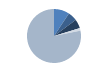
| Category | Series 0 |
|---|---|
| ARRASTRE | 112 |
| CERCO | 67 |
| PALANGRE | 65 |
| REDES DE ENMALLE | 19 |
| ARTES MENORES | 941 |
| SIN TIPO ASIGNADO | 0 |